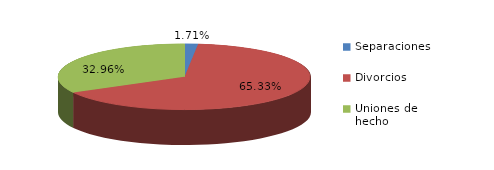
| Category | Series 0 |
|---|---|
| Separaciones | 20 |
| Divorcios | 765 |
| Uniones de hecho | 386 |